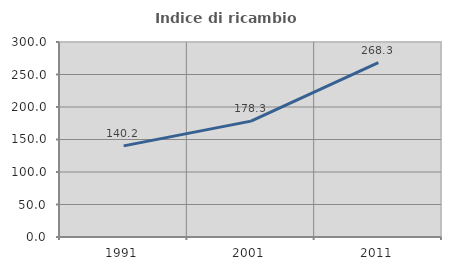
| Category | Indice di ricambio occupazionale  |
|---|---|
| 1991.0 | 140.152 |
| 2001.0 | 178.261 |
| 2011.0 | 268.323 |